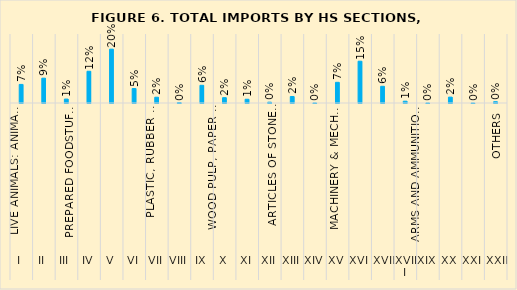
| Category | Series 0 |
|---|---|
| 0 | 0.067 |
| 1 | 0.09 |
| 2 | 0.014 |
| 3 | 0.115 |
| 4 | 0.195 |
| 5 | 0.052 |
| 6 | 0.021 |
| 7 | 0.002 |
| 8 | 0.064 |
| 9 | 0.019 |
| 10 | 0.014 |
| 11 | 0.003 |
| 12 | 0.024 |
| 13 | 0 |
| 14 | 0.075 |
| 15 | 0.151 |
| 16 | 0.061 |
| 17 | 0.007 |
| 18 | 0 |
| 19 | 0.021 |
| 20 | 0 |
| 21 | 0.005 |